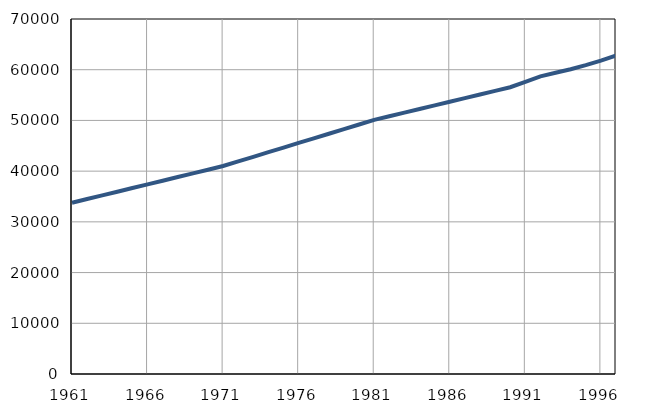
| Category | Број
становника |
|---|---|
| 1961.0 | 33779 |
| 1962.0 | 34502 |
| 1963.0 | 35225 |
| 1964.0 | 35948 |
| 1965.0 | 36671 |
| 1966.0 | 37394 |
| 1967.0 | 38117 |
| 1968.0 | 38840 |
| 1969.0 | 39563 |
| 1970.0 | 40286 |
| 1971.0 | 41009 |
| 1972.0 | 41919 |
| 1973.0 | 42829 |
| 1974.0 | 43739 |
| 1975.0 | 44649 |
| 1976.0 | 45559 |
| 1977.0 | 46469 |
| 1978.0 | 47379 |
| 1979.0 | 48289 |
| 1980.0 | 49199 |
| 1981.0 | 50104 |
| 1982.0 | 50820 |
| 1983.0 | 51536 |
| 1984.0 | 52252 |
| 1985.0 | 52968 |
| 1986.0 | 53684 |
| 1987.0 | 54400 |
| 1988.0 | 55116 |
| 1989.0 | 55832 |
| 1990.0 | 56548 |
| 1991.0 | 57600 |
| 1992.0 | 58700 |
| 1993.0 | 59400 |
| 1994.0 | 60100 |
| 1995.0 | 60900 |
| 1996.0 | 61800 |
| 1997.0 | 62800 |